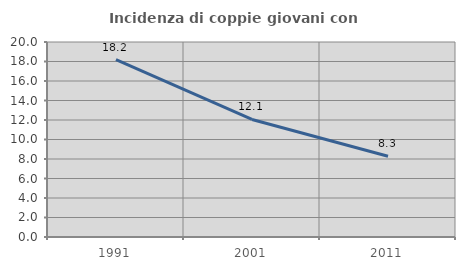
| Category | Incidenza di coppie giovani con figli |
|---|---|
| 1991.0 | 18.182 |
| 2001.0 | 12.055 |
| 2011.0 | 8.284 |